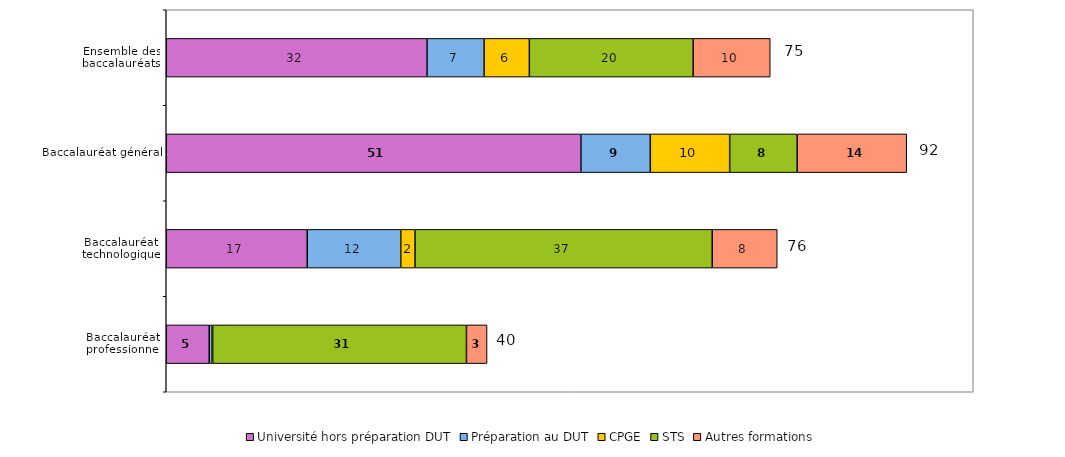
| Category | Université hors préparation DUT | Préparation au DUT | CPGE | STS | Autres formations |
|---|---|---|---|---|---|
| Ensemble des baccalauréats | 32.319 | 7.066 | 5.61 | 20.298 | 9.548 |
| Baccalauréat général | 51.384 | 8.598 | 9.836 | 8.363 | 13.572 |
| Baccalauréat technologique | 17.471 | 11.592 | 1.764 | 36.828 | 8.052 |
| Baccalauréat professionnel | 5.327 | 0.357 | 0.067 | 31.45 | 2.551 |